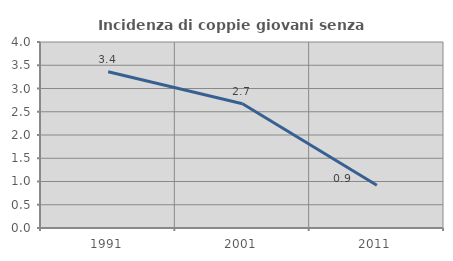
| Category | Incidenza di coppie giovani senza figli |
|---|---|
| 1991.0 | 3.359 |
| 2001.0 | 2.672 |
| 2011.0 | 0.917 |